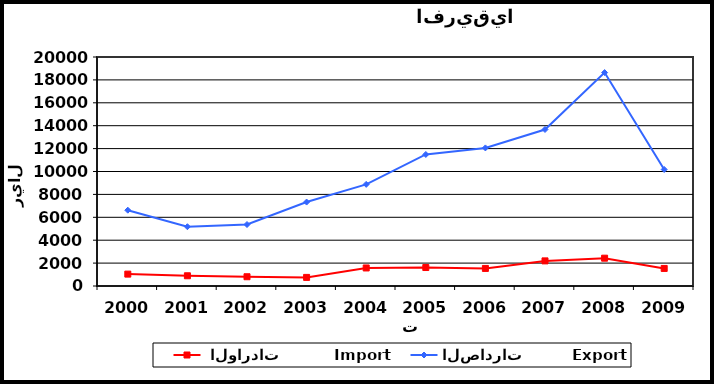
| Category |  الواردات           Import | الصادرات          Export |
|---|---|---|
| 2000.0 | 1038 | 6621 |
| 2001.0 | 893 | 5178 |
| 2002.0 | 809 | 5370 |
| 2003.0 | 751 | 7331 |
| 2004.0 | 1576 | 8876 |
| 2005.0 | 1614 | 11487 |
| 2006.0 | 1534 | 12060 |
| 2007.0 | 2193 | 13669 |
| 2008.0 | 2430 | 18638 |
| 2009.0 | 1534 | 10175 |